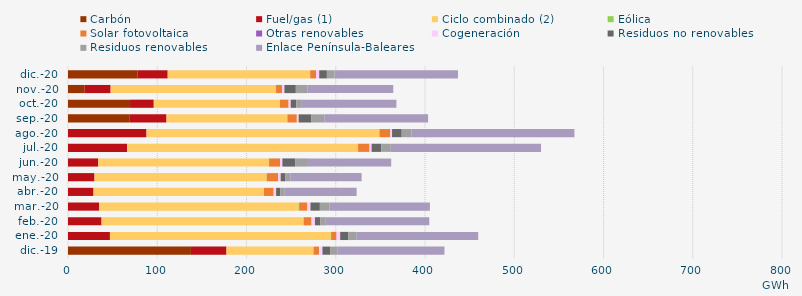
| Category | Carbón | Fuel/gas (1) | Ciclo combinado (2) | Eólica | Solar fotovoltaica | Otras renovables | Cogeneración | Residuos no renovables | Residuos renovables | Enlace Península-Baleares |
|---|---|---|---|---|---|---|---|---|---|---|
| dic.-19 | 137.717 | 39.851 | 97.226 | 0.445 | 5.906 | 0.181 | 3.776 | 8.548 | 8.548 | 119.614 |
| ene.-20 | -3.177 | 46.988 | 247.428 | 0.371 | 5.934 | 0.201 | 4.038 | 9.262 | 9.262 | 136.156 |
| feb.-20 | -1.357 | 37.598 | 226.174 | 0.339 | 8.736 | 0.082 | 3.745 | 6.096 | 6.096 | 115.928 |
| mar.-20 | -1.702 | 34.745 | 223.688 | 0.533 | 9.203 | 0.027 | 3.476 | 10.532 | 10.532 | 112.78 |
| abr.-20 | -1.684 | 28.608 | 190.732 | 0.243 | 10.826 | 0.015 | 2.76 | 4.815 | 4.815 | 80.581 |
| may.-20 | -1.802 | 29.693 | 192.661 | 0.353 | 12.901 | 0.002 | 2.681 | 5.366 | 5.366 | 79.947 |
| jun.-20 | -1.281 | 33.873 | 191.226 | 0.218 | 12.233 | 0.06 | 2.597 | 14.316 | 14.316 | 93.29 |
| jul.-20 | -1.12 | 66.276 | 258.526 | 0.221 | 12.747 | 0.053 | 2.332 | 10.772 | 10.772 | 168.332 |
| ago.-20 | -1.127 | 87.96 | 260.888 | 0.209 | 12.07 | 0.05 | 1.922 | 10.811 | 10.811 | 182.716 |
| sep.-20 | 68.615 | 41.727 | 135.309 | 0.19 | 10.538 | 0.003 | 2.048 | 14.376 | 14.376 | 116.275 |
| oct.-20 | 69.532 | 26.56 | 141.136 | 0.328 | 9.629 | 0.027 | 2.333 | 6.238 | 6.238 | 105.944 |
| nov.-20 | 18.69 | 29.083 | 185.015 | 0.349 | 6.745 | 0.069 | 2.521 | 12.813 | 12.813 | 96.328 |
| dic.-20 | 78.075 | 33.65 | 159.354 | 0.286 | 6.694 | 0.04 | 3.369 | 8.605 | 8.605 | 138.262 |